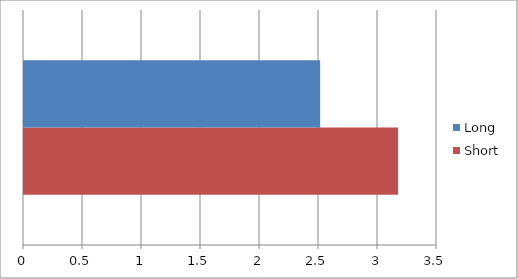
| Category | Short | Long |
|---|---|---|
| 0 | 3.17 | 2.51 |